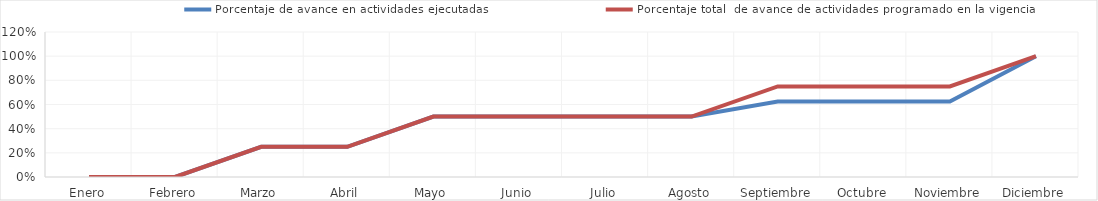
| Category | Porcentaje de avance en actividades ejecutadas | Porcentaje total  de avance de actividades programado en la vigencia |
|---|---|---|
| 0 | 0 | 0 |
| 1 | 0 | 0 |
| 2 | 0.25 | 0.25 |
| 3 | 0.25 | 0.25 |
| 4 | 0.5 | 0.5 |
| 5 | 0.5 | 0.5 |
| 6 | 0.5 | 0.5 |
| 7 | 0.5 | 0.5 |
| 8 | 0.625 | 0.75 |
| 9 | 0.625 | 0.75 |
| 10 | 0.625 | 0.75 |
| 11 | 1 | 1 |